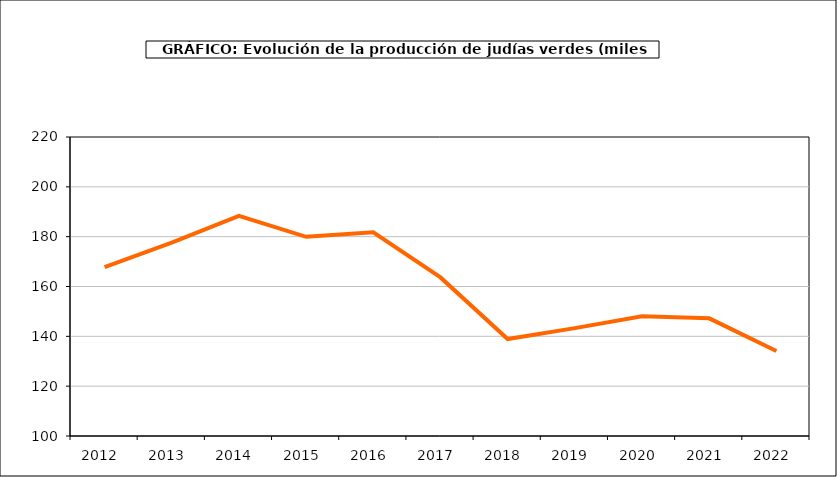
| Category | producción |
|---|---|
| 2012.0 | 167.816 |
| 2013.0 | 177.588 |
| 2014.0 | 188.38 |
| 2015.0 | 179.947 |
| 2016.0 | 181.725 |
| 2017.0 | 163.649 |
| 2018.0 | 138.925 |
| 2019.0 | 143.289 |
| 2020.0 | 148.016 |
| 2021.0 | 147.216 |
| 2022.0 | 134.1 |